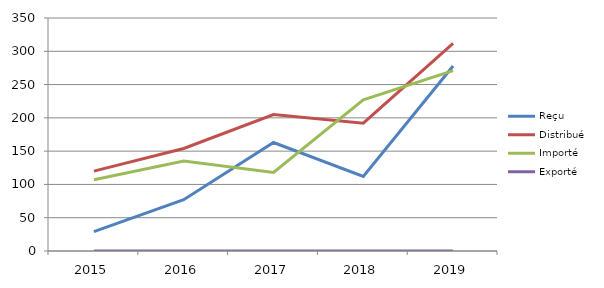
| Category | Reçu | Distribué | Importé | Exporté |
|---|---|---|---|---|
| 2015.0 | 29 | 120 | 107 | 0 |
| 2016.0 | 77 | 154 | 135 | 0 |
| 2017.0 | 163 | 205 | 118 | 0 |
| 2018.0 | 112 | 192 | 227 | 0 |
| 2019.0 | 278 | 312 | 271 | 0 |